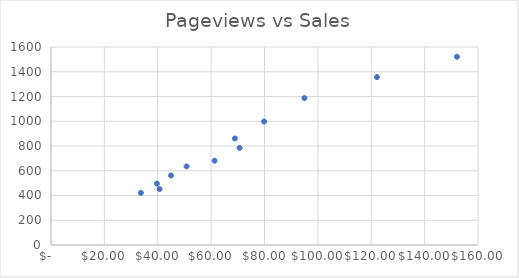
| Category | Series 0 |
|---|---|
| 33.68 | 421 |
| 40.68 | 452 |
| 39.68 | 496 |
| 44.96 | 562 |
| 50.800000000000004 | 635 |
| 61.29 | 681 |
| 70.64999999999999 | 785 |
| 68.88 | 861 |
| 79.84 | 998 |
| 94.96000000000001 | 1187 |
| 122.13 | 1357 |
| 152.1 | 1521 |